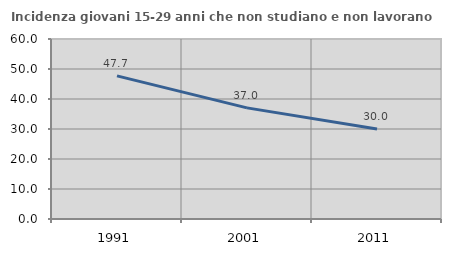
| Category | Incidenza giovani 15-29 anni che non studiano e non lavorano  |
|---|---|
| 1991.0 | 47.701 |
| 2001.0 | 37.043 |
| 2011.0 | 29.975 |